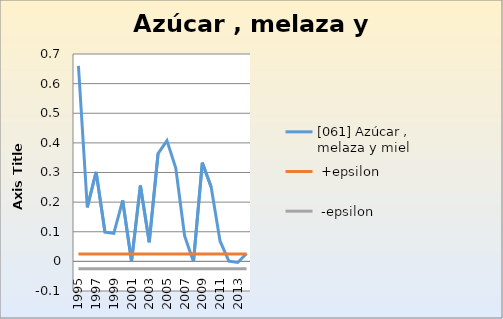
| Category | [061] Azúcar , melaza y miel  |  +epsilon |  -epsilon |
|---|---|---|---|
| 1995.0 | 0.66 | 0.025 | -0.025 |
| 1996.0 | 0.182 | 0.025 | -0.025 |
| 1997.0 | 0.302 | 0.025 | -0.025 |
| 1998.0 | 0.098 | 0.025 | -0.025 |
| 1999.0 | 0.094 | 0.025 | -0.025 |
| 2000.0 | 0.206 | 0.025 | -0.025 |
| 2001.0 | 0 | 0.025 | -0.025 |
| 2002.0 | 0.256 | 0.025 | -0.025 |
| 2003.0 | 0.065 | 0.025 | -0.025 |
| 2004.0 | 0.364 | 0.025 | -0.025 |
| 2005.0 | 0.408 | 0.025 | -0.025 |
| 2006.0 | 0.315 | 0.025 | -0.025 |
| 2007.0 | 0.086 | 0.025 | -0.025 |
| 2008.0 | -0.001 | 0.025 | -0.025 |
| 2009.0 | 0.333 | 0.025 | -0.025 |
| 2010.0 | 0.251 | 0.025 | -0.025 |
| 2011.0 | 0.069 | 0.025 | -0.025 |
| 2012.0 | 0.001 | 0.025 | -0.025 |
| 2013.0 | -0.004 | 0.025 | -0.025 |
| 2014.0 | 0.027 | 0.025 | -0.025 |